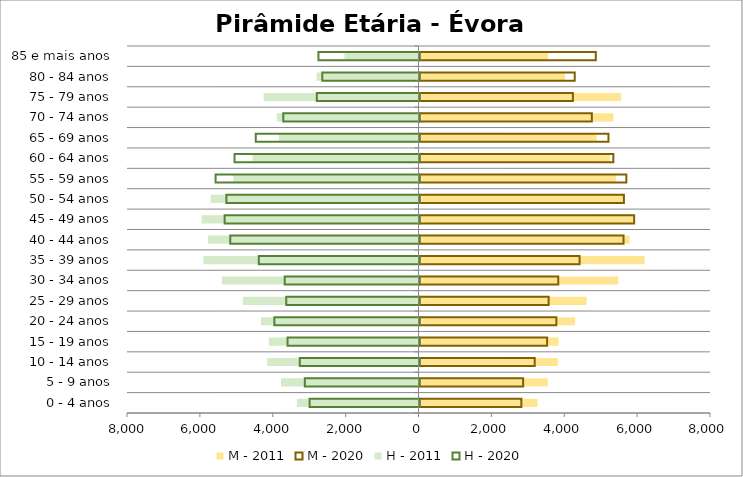
| Category | M - 2011 | M - 2020 | H - 2011 | H - 2020 |
|---|---|---|---|---|
| 0 - 4 anos | 3237 | 2795 | -3337 | -3016 |
| 5 - 9 anos | 3522 | 2844 | -3773 | -3147 |
| 10 - 14 anos | 3798 | 3162 | -4151 | -3286 |
| 15 - 19 anos | 3815 | 3502 | -4107 | -3621 |
| 20 - 24 anos | 4270 | 3756 | -4324 | -3983 |
| 25 - 29 anos | 4588 | 3544 | -4818 | -3657 |
| 30 - 34 anos | 5454 | 3808 | -5394 | -3699 |
| 35 - 39 anos | 6179 | 4393 | -5903 | -4410 |
| 40 - 44 anos | 5764 | 5599 | -5777 | -5194 |
| 45 - 49 anos | 5911 | 5891 | -5952 | -5348 |
| 50 - 54 anos | 5611 | 5610 | -5700 | -5300 |
| 55 - 59 anos | 5397 | 5676 | -5082 | -5596 |
| 60 - 64 anos | 5226 | 5320 | -4555 | -5076 |
| 65 - 69 anos | 4860 | 5186 | -3831 | -4494 |
| 70 - 74 anos | 5322 | 4729 | -3890 | -3739 |
| 75 - 79 anos | 5535 | 4210 | -4249 | -2818 |
| 80 - 84 anos | 3997 | 4260 | -2794 | -2668 |
| 85 e mais anos | 3532 | 4838 | -2033 | -2774 |